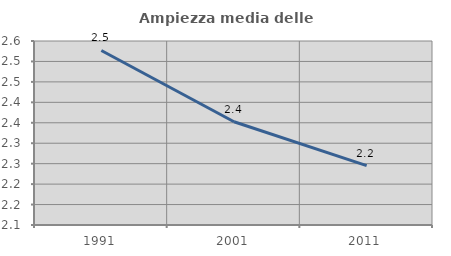
| Category | Ampiezza media delle famiglie |
|---|---|
| 1991.0 | 2.527 |
| 2001.0 | 2.353 |
| 2011.0 | 2.245 |